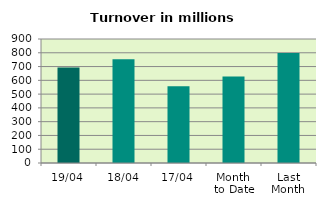
| Category | Series 0 |
|---|---|
| 19/04 | 693.206 |
| 18/04 | 752.725 |
| 17/04 | 557.132 |
| Month 
to Date | 627.134 |
| Last
Month | 798.115 |